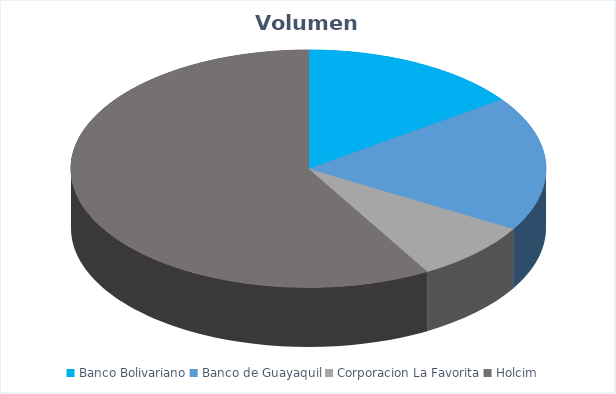
| Category | VOLUMEN ($USD) |
|---|---|
| Banco Bolivariano | 8800 |
| Banco de Guayaquil | 10712.52 |
| Corporacion La Favorita | 4780.79 |
| Holcim | 34000 |